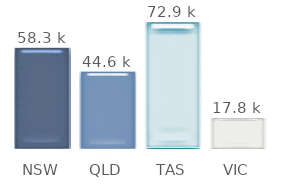
| Category | Series 0 |
|---|---|
| NSW | 58.32 |
| QLD | 44.55 |
| TAS | 72.9 |
| VIC | 17.82 |